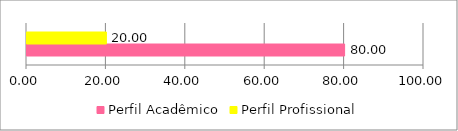
| Category | Perfil Acadêmico | Perfil Profissional |
|---|---|---|
| 0 | 80 | 20 |